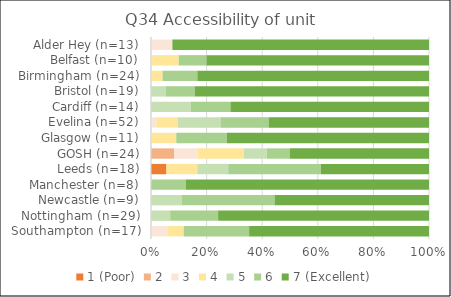
| Category | 1 (Poor) | 2 | 3 | 4 | 5 | 6 | 7 (Excellent) |
|---|---|---|---|---|---|---|---|
| Southampton (n=17) | 0 | 0 | 1 | 1 | 0 | 4 | 11 |
| Nottingham (n=29) | 0 | 0 | 0 | 0 | 2 | 5 | 22 |
| Newcastle (n=9) | 0 | 0 | 0 | 0 | 1 | 3 | 5 |
| Manchester (n=8) | 0 | 0 | 0 | 0 | 0 | 1 | 7 |
| Leeds (n=18) | 1 | 0 | 0 | 2 | 2 | 6 | 7 |
| GOSH (n=24) | 0 | 2 | 2 | 4 | 2 | 2 | 12 |
| Glasgow (n=11) | 0 | 0 | 0 | 1 | 0 | 2 | 8 |
| Evelina (n=52) | 0 | 0 | 1 | 4 | 8 | 9 | 30 |
| Cardiff (n=14) | 0 | 0 | 0 | 0 | 2 | 2 | 10 |
| Bristol (n=19) | 0 | 0 | 0 | 0 | 1 | 2 | 16 |
| Birmingham (n=24) | 0 | 0 | 0 | 1 | 0 | 3 | 20 |
| Belfast (n=10) | 0 | 0 | 0 | 1 | 0 | 1 | 8 |
| Alder Hey (n=13) | 0 | 0 | 1 | 0 | 0 | 0 | 12 |